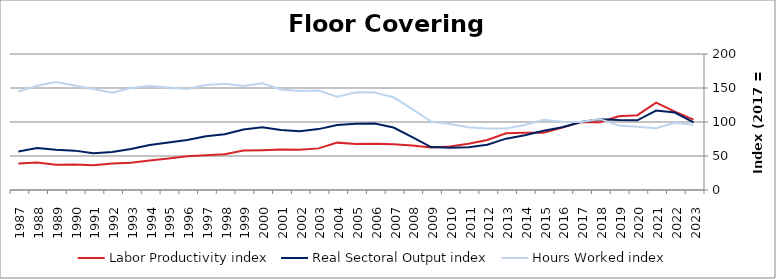
| Category | Labor Productivity index | Real Sectoral Output index | Hours Worked index |
|---|---|---|---|
| 2023.0 | 103.508 | 99.497 | 96.124 |
| 2022.0 | 115.194 | 113.944 | 98.915 |
| 2021.0 | 128.549 | 116.861 | 90.907 |
| 2020.0 | 110.081 | 102.52 | 93.132 |
| 2019.0 | 108.555 | 102.851 | 94.745 |
| 2018.0 | 99.54 | 104.035 | 104.516 |
| 2017.0 | 100 | 100 | 100 |
| 2016.0 | 91.937 | 92.394 | 100.497 |
| 2015.0 | 84.33 | 87.132 | 103.323 |
| 2014.0 | 84.215 | 80.57 | 95.672 |
| 2013.0 | 83.441 | 75.501 | 90.484 |
| 2012.0 | 73.592 | 66.541 | 90.418 |
| 2011.0 | 68.053 | 62.752 | 92.211 |
| 2010.0 | 63.908 | 62.123 | 97.206 |
| 2009.0 | 62.681 | 63.14 | 100.734 |
| 2008.0 | 65.571 | 77.913 | 118.824 |
| 2007.0 | 67.401 | 91.884 | 136.325 |
| 2006.0 | 68.173 | 97.633 | 143.214 |
| 2005.0 | 67.624 | 97.27 | 143.839 |
| 2004.0 | 69.662 | 95.497 | 137.087 |
| 2003.0 | 61.205 | 89.549 | 146.31 |
| 2002.0 | 59.329 | 86.344 | 145.534 |
| 2001.0 | 59.642 | 88.145 | 147.789 |
| 2000.0 | 58.614 | 92.087 | 157.108 |
| 1999.0 | 58.165 | 89.01 | 153.03 |
| 1998.0 | 52.474 | 81.955 | 156.183 |
| 1997.0 | 51.183 | 79.063 | 154.472 |
| 1996.0 | 49.559 | 73.652 | 148.615 |
| 1995.0 | 46.449 | 69.995 | 150.692 |
| 1994.0 | 43.263 | 66.203 | 153.025 |
| 1993.0 | 40.169 | 60.26 | 150.017 |
| 1992.0 | 39.047 | 55.797 | 142.897 |
| 1991.0 | 36.491 | 54.191 | 148.505 |
| 1990.0 | 37.671 | 57.898 | 153.694 |
| 1989.0 | 37.184 | 59.08 | 158.887 |
| 1988.0 | 40.297 | 61.78 | 153.312 |
| 1987.0 | 39.1 | 56.595 | 144.744 |